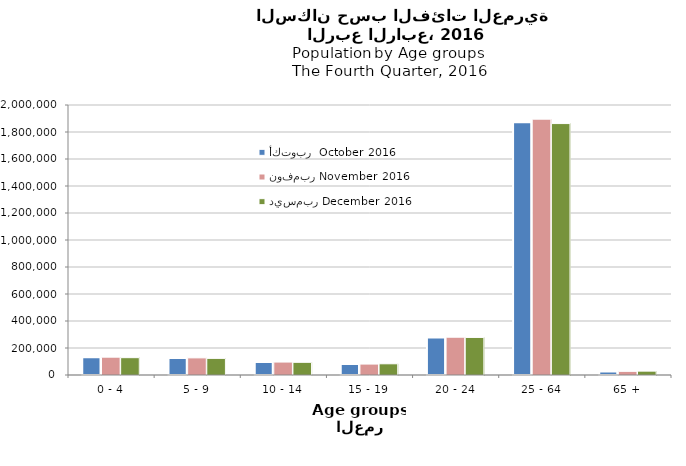
| Category | أكتوبر  October 2016 | نوفمبر November 2016  | ديسمبر December 2016  |
|---|---|---|---|
| 0 - 4 | 131114 | 131949 | 128270 |
| 5 - 9 | 126436 | 126785 | 123102 |
| 10 - 14 | 95945 | 95864 | 93963 |
| 15 - 19 | 81099 | 81014 | 82903 |
| 20 - 24 | 277073 | 279775 | 278189 |
| 25 - 64 | 1873058 | 1894965 | 1862402 |
| 65 + | 26797 | 26950 | 28624 |